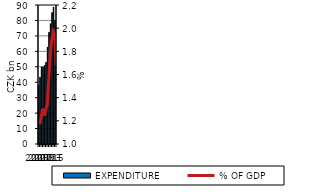
| Category | EXPENDITURE |
|---|---|
| 2005.0 | 38.146 |
| 2006.0 | 43.268 |
| 2007.0 | 50.009 |
| 2008.0 | 49.872 |
| 2009.0 | 50.875 |
| 2010.0 | 52.974 |
| 2011.0 | 62.753 |
| 2012.0 | 72.36 |
| 2013.0 | 77.853 |
| 2014.0 | 85.104 |
| 2015.0 | 88.663 |
| 2016.0 | 80.109 |